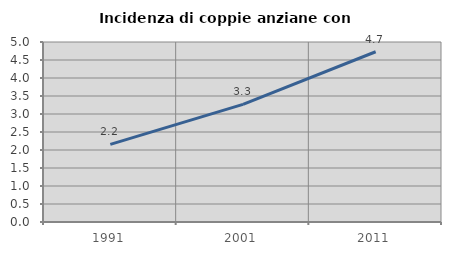
| Category | Incidenza di coppie anziane con figli |
|---|---|
| 1991.0 | 2.156 |
| 2001.0 | 3.266 |
| 2011.0 | 4.729 |